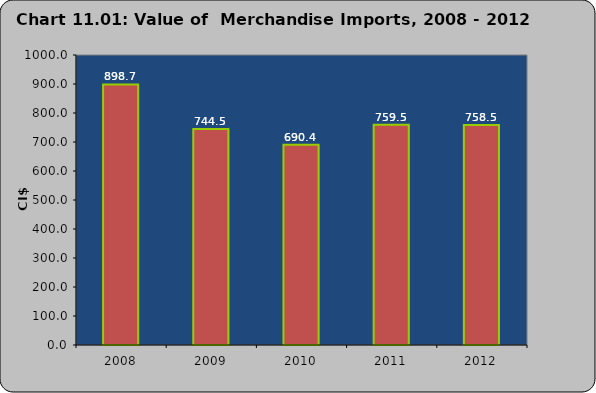
| Category | Series 0 |
|---|---|
| 2008 | 898.694 |
| 2009 | 744.538 |
| 2010 | 690.388 |
| 2011 | 759.5 |
| 2012 | 758.5 |